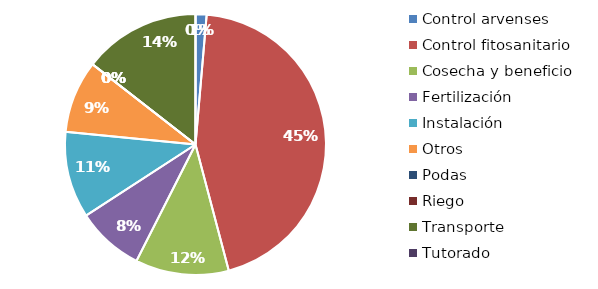
| Category | Valor |
|---|---|
| Control arvenses | 102380 |
| Control fitosanitario | 3335448 |
| Cosecha y beneficio | 867131.38 |
| Fertilización | 627095 |
| Instalación | 802899.426 |
| Otros | 672429 |
| Podas | 0 |
| Riego | 0 |
| Transporte | 1083914 |
| Tutorado | 0 |